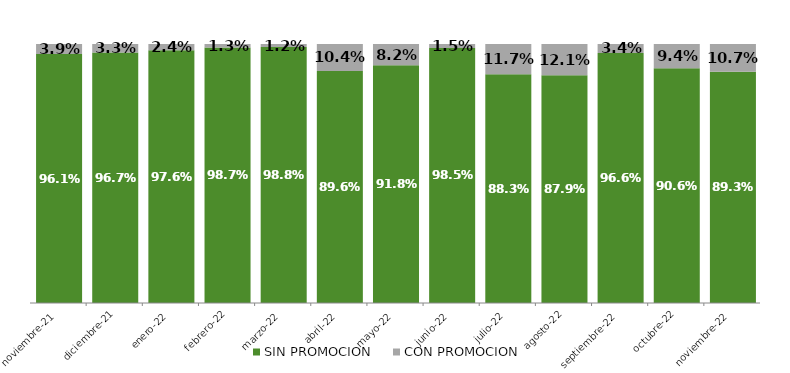
| Category | SIN PROMOCION   | CON PROMOCION   |
|---|---|---|
| 2021-11-01 | 0.961 | 0.039 |
| 2021-12-01 | 0.967 | 0.033 |
| 2022-01-01 | 0.976 | 0.024 |
| 2022-02-01 | 0.987 | 0.013 |
| 2022-03-01 | 0.988 | 0.012 |
| 2022-04-01 | 0.896 | 0.104 |
| 2022-05-01 | 0.918 | 0.082 |
| 2022-06-01 | 0.985 | 0.015 |
| 2022-07-01 | 0.883 | 0.117 |
| 2022-08-01 | 0.879 | 0.121 |
| 2022-09-01 | 0.966 | 0.034 |
| 2022-10-01 | 0.906 | 0.094 |
| 2022-11-01 | 0.893 | 0.107 |